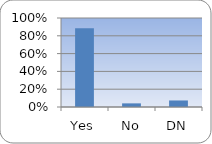
| Category | Series 0 |
|---|---|
| Yes | 0.886 |
| No | 0.041 |
| DN | 0.073 |